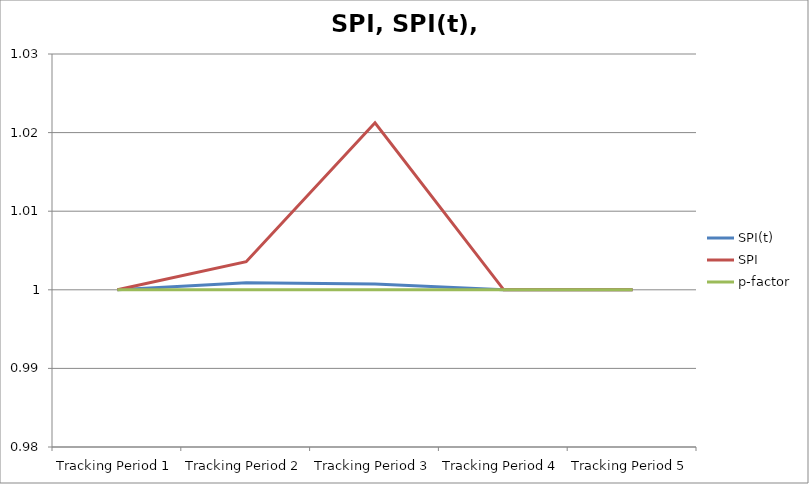
| Category | SPI(t) | SPI | p-factor |
|---|---|---|---|
| Tracking Period 1 | 1 | 1 | 1 |
| Tracking Period 2 | 1.001 | 1.004 | 1 |
| Tracking Period 3 | 1.001 | 1.021 | 1 |
| Tracking Period 4 | 1 | 1 | 1 |
| Tracking Period 5 | 1 | 1 | 1 |